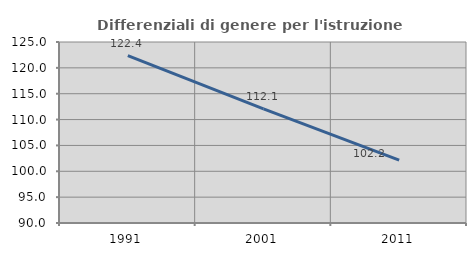
| Category | Differenziali di genere per l'istruzione superiore |
|---|---|
| 1991.0 | 122.379 |
| 2001.0 | 112.061 |
| 2011.0 | 102.165 |